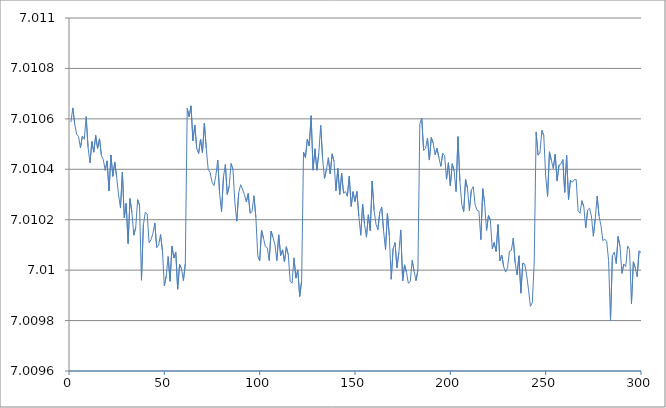
| Category | z(i) |
|---|---|
| 0 | 7.011 |
| 1 | 7.011 |
| 2 | 7.011 |
| 3 | 7.011 |
| 4 | 7.011 |
| 5 | 7.01 |
| 6 | 7.011 |
| 7 | 7.011 |
| 8 | 7.011 |
| 9 | 7.01 |
| 10 | 7.01 |
| 11 | 7.011 |
| 12 | 7.01 |
| 13 | 7.011 |
| 14 | 7.01 |
| 15 | 7.011 |
| 16 | 7.01 |
| 17 | 7.01 |
| 18 | 7.01 |
| 19 | 7.01 |
| 20 | 7.01 |
| 21 | 7.01 |
| 22 | 7.01 |
| 23 | 7.01 |
| 24 | 7.01 |
| 25 | 7.01 |
| 26 | 7.01 |
| 27 | 7.01 |
| 28 | 7.01 |
| 29 | 7.01 |
| 30 | 7.01 |
| 31 | 7.01 |
| 32 | 7.01 |
| 33 | 7.01 |
| 34 | 7.01 |
| 35 | 7.01 |
| 36 | 7.01 |
| 37 | 7.01 |
| 38 | 7.01 |
| 39 | 7.01 |
| 40 | 7.01 |
| 41 | 7.01 |
| 42 | 7.01 |
| 43 | 7.01 |
| 44 | 7.01 |
| 45 | 7.01 |
| 46 | 7.01 |
| 47 | 7.01 |
| 48 | 7.01 |
| 49 | 7.01 |
| 50 | 7.01 |
| 51 | 7.01 |
| 52 | 7.01 |
| 53 | 7.01 |
| 54 | 7.01 |
| 55 | 7.01 |
| 56 | 7.01 |
| 57 | 7.01 |
| 58 | 7.01 |
| 59 | 7.01 |
| 60 | 7.01 |
| 61 | 7.011 |
| 62 | 7.011 |
| 63 | 7.011 |
| 64 | 7.011 |
| 65 | 7.011 |
| 66 | 7.01 |
| 67 | 7.01 |
| 68 | 7.011 |
| 69 | 7.01 |
| 70 | 7.011 |
| 71 | 7.01 |
| 72 | 7.01 |
| 73 | 7.01 |
| 74 | 7.01 |
| 75 | 7.01 |
| 76 | 7.01 |
| 77 | 7.01 |
| 78 | 7.01 |
| 79 | 7.01 |
| 80 | 7.01 |
| 81 | 7.01 |
| 82 | 7.01 |
| 83 | 7.01 |
| 84 | 7.01 |
| 85 | 7.01 |
| 86 | 7.01 |
| 87 | 7.01 |
| 88 | 7.01 |
| 89 | 7.01 |
| 90 | 7.01 |
| 91 | 7.01 |
| 92 | 7.01 |
| 93 | 7.01 |
| 94 | 7.01 |
| 95 | 7.01 |
| 96 | 7.01 |
| 97 | 7.01 |
| 98 | 7.01 |
| 99 | 7.01 |
| 100 | 7.01 |
| 101 | 7.01 |
| 102 | 7.01 |
| 103 | 7.01 |
| 104 | 7.01 |
| 105 | 7.01 |
| 106 | 7.01 |
| 107 | 7.01 |
| 108 | 7.01 |
| 109 | 7.01 |
| 110 | 7.01 |
| 111 | 7.01 |
| 112 | 7.01 |
| 113 | 7.01 |
| 114 | 7.01 |
| 115 | 7.01 |
| 116 | 7.01 |
| 117 | 7.01 |
| 118 | 7.01 |
| 119 | 7.01 |
| 120 | 7.01 |
| 121 | 7.01 |
| 122 | 7.01 |
| 123 | 7.01 |
| 124 | 7.011 |
| 125 | 7.01 |
| 126 | 7.011 |
| 127 | 7.01 |
| 128 | 7.01 |
| 129 | 7.01 |
| 130 | 7.01 |
| 131 | 7.011 |
| 132 | 7.01 |
| 133 | 7.01 |
| 134 | 7.01 |
| 135 | 7.01 |
| 136 | 7.01 |
| 137 | 7.01 |
| 138 | 7.01 |
| 139 | 7.01 |
| 140 | 7.01 |
| 141 | 7.01 |
| 142 | 7.01 |
| 143 | 7.01 |
| 144 | 7.01 |
| 145 | 7.01 |
| 146 | 7.01 |
| 147 | 7.01 |
| 148 | 7.01 |
| 149 | 7.01 |
| 150 | 7.01 |
| 151 | 7.01 |
| 152 | 7.01 |
| 153 | 7.01 |
| 154 | 7.01 |
| 155 | 7.01 |
| 156 | 7.01 |
| 157 | 7.01 |
| 158 | 7.01 |
| 159 | 7.01 |
| 160 | 7.01 |
| 161 | 7.01 |
| 162 | 7.01 |
| 163 | 7.01 |
| 164 | 7.01 |
| 165 | 7.01 |
| 166 | 7.01 |
| 167 | 7.01 |
| 168 | 7.01 |
| 169 | 7.01 |
| 170 | 7.01 |
| 171 | 7.01 |
| 172 | 7.01 |
| 173 | 7.01 |
| 174 | 7.01 |
| 175 | 7.01 |
| 176 | 7.01 |
| 177 | 7.01 |
| 178 | 7.01 |
| 179 | 7.01 |
| 180 | 7.01 |
| 181 | 7.01 |
| 182 | 7.01 |
| 183 | 7.011 |
| 184 | 7.011 |
| 185 | 7.01 |
| 186 | 7.01 |
| 187 | 7.011 |
| 188 | 7.01 |
| 189 | 7.011 |
| 190 | 7.011 |
| 191 | 7.01 |
| 192 | 7.01 |
| 193 | 7.01 |
| 194 | 7.01 |
| 195 | 7.01 |
| 196 | 7.01 |
| 197 | 7.01 |
| 198 | 7.01 |
| 199 | 7.01 |
| 200 | 7.01 |
| 201 | 7.01 |
| 202 | 7.01 |
| 203 | 7.011 |
| 204 | 7.01 |
| 205 | 7.01 |
| 206 | 7.01 |
| 207 | 7.01 |
| 208 | 7.01 |
| 209 | 7.01 |
| 210 | 7.01 |
| 211 | 7.01 |
| 212 | 7.01 |
| 213 | 7.01 |
| 214 | 7.01 |
| 215 | 7.01 |
| 216 | 7.01 |
| 217 | 7.01 |
| 218 | 7.01 |
| 219 | 7.01 |
| 220 | 7.01 |
| 221 | 7.01 |
| 222 | 7.01 |
| 223 | 7.01 |
| 224 | 7.01 |
| 225 | 7.01 |
| 226 | 7.01 |
| 227 | 7.01 |
| 228 | 7.01 |
| 229 | 7.01 |
| 230 | 7.01 |
| 231 | 7.01 |
| 232 | 7.01 |
| 233 | 7.01 |
| 234 | 7.01 |
| 235 | 7.01 |
| 236 | 7.01 |
| 237 | 7.01 |
| 238 | 7.01 |
| 239 | 7.01 |
| 240 | 7.01 |
| 241 | 7.01 |
| 242 | 7.01 |
| 243 | 7.01 |
| 244 | 7.011 |
| 245 | 7.01 |
| 246 | 7.01 |
| 247 | 7.011 |
| 248 | 7.011 |
| 249 | 7.01 |
| 250 | 7.01 |
| 251 | 7.01 |
| 252 | 7.01 |
| 253 | 7.01 |
| 254 | 7.01 |
| 255 | 7.01 |
| 256 | 7.01 |
| 257 | 7.01 |
| 258 | 7.01 |
| 259 | 7.01 |
| 260 | 7.01 |
| 261 | 7.01 |
| 262 | 7.01 |
| 263 | 7.01 |
| 264 | 7.01 |
| 265 | 7.01 |
| 266 | 7.01 |
| 267 | 7.01 |
| 268 | 7.01 |
| 269 | 7.01 |
| 270 | 7.01 |
| 271 | 7.01 |
| 272 | 7.01 |
| 273 | 7.01 |
| 274 | 7.01 |
| 275 | 7.01 |
| 276 | 7.01 |
| 277 | 7.01 |
| 278 | 7.01 |
| 279 | 7.01 |
| 280 | 7.01 |
| 281 | 7.01 |
| 282 | 7.01 |
| 283 | 7.01 |
| 284 | 7.01 |
| 285 | 7.01 |
| 286 | 7.01 |
| 287 | 7.01 |
| 288 | 7.01 |
| 289 | 7.01 |
| 290 | 7.01 |
| 291 | 7.01 |
| 292 | 7.01 |
| 293 | 7.01 |
| 294 | 7.01 |
| 295 | 7.01 |
| 296 | 7.01 |
| 297 | 7.01 |
| 298 | 7.01 |
| 299 | 7.01 |
| 300 | 7.01 |
| 301 | 7.01 |
| 302 | 7.01 |
| 303 | 7.01 |
| 304 | 7.01 |
| 305 | 7.011 |
| 306 | 7.011 |
| 307 | 7.01 |
| 308 | 7.011 |
| 309 | 7.011 |
| 310 | 7.011 |
| 311 | 7.011 |
| 312 | 7.01 |
| 313 | 7.011 |
| 314 | 7.011 |
| 315 | 7.011 |
| 316 | 7.01 |
| 317 | 7.011 |
| 318 | 7.01 |
| 319 | 7.01 |
| 320 | 7.01 |
| 321 | 7.01 |
| 322 | 7.01 |
| 323 | 7.011 |
| 324 | 7.01 |
| 325 | 7.011 |
| 326 | 7.01 |
| 327 | 7.01 |
| 328 | 7.01 |
| 329 | 7.011 |
| 330 | 7.01 |
| 331 | 7.01 |
| 332 | 7.01 |
| 333 | 7.01 |
| 334 | 7.01 |
| 335 | 7.01 |
| 336 | 7.01 |
| 337 | 7.01 |
| 338 | 7.01 |
| 339 | 7.01 |
| 340 | 7.01 |
| 341 | 7.01 |
| 342 | 7.01 |
| 343 | 7.01 |
| 344 | 7.01 |
| 345 | 7.01 |
| 346 | 7.01 |
| 347 | 7.01 |
| 348 | 7.01 |
| 349 | 7.01 |
| 350 | 7.01 |
| 351 | 7.01 |
| 352 | 7.01 |
| 353 | 7.01 |
| 354 | 7.01 |
| 355 | 7.01 |
| 356 | 7.01 |
| 357 | 7.01 |
| 358 | 7.01 |
| 359 | 7.01 |
| 360 | 7.01 |
| 361 | 7.01 |
| 362 | 7.01 |
| 363 | 7.01 |
| 364 | 7.01 |
| 365 | 7.01 |
| 366 | 7.01 |
| 367 | 7.01 |
| 368 | 7.011 |
| 369 | 7.011 |
| 370 | 7.011 |
| 371 | 7.011 |
| 372 | 7.01 |
| 373 | 7.01 |
| 374 | 7.01 |
| 375 | 7.01 |
| 376 | 7.01 |
| 377 | 7.01 |
| 378 | 7.011 |
| 379 | 7.01 |
| 380 | 7.01 |
| 381 | 7.01 |
| 382 | 7.01 |
| 383 | 7.01 |
| 384 | 7.01 |
| 385 | 7.01 |
| 386 | 7.01 |
| 387 | 7.01 |
| 388 | 7.01 |
| 389 | 7.01 |
| 390 | 7.01 |
| 391 | 7.01 |
| 392 | 7.01 |
| 393 | 7.01 |
| 394 | 7.01 |
| 395 | 7.01 |
| 396 | 7.01 |
| 397 | 7.01 |
| 398 | 7.01 |
| 399 | 7.01 |
| 400 | 7.01 |
| 401 | 7.01 |
| 402 | 7.01 |
| 403 | 7.01 |
| 404 | 7.01 |
| 405 | 7.01 |
| 406 | 7.01 |
| 407 | 7.01 |
| 408 | 7.01 |
| 409 | 7.01 |
| 410 | 7.01 |
| 411 | 7.01 |
| 412 | 7.01 |
| 413 | 7.01 |
| 414 | 7.01 |
| 415 | 7.01 |
| 416 | 7.01 |
| 417 | 7.01 |
| 418 | 7.01 |
| 419 | 7.01 |
| 420 | 7.01 |
| 421 | 7.01 |
| 422 | 7.01 |
| 423 | 7.01 |
| 424 | 7.01 |
| 425 | 7.01 |
| 426 | 7.01 |
| 427 | 7.011 |
| 428 | 7.011 |
| 429 | 7.011 |
| 430 | 7.01 |
| 431 | 7.011 |
| 432 | 7.01 |
| 433 | 7.01 |
| 434 | 7.01 |
| 435 | 7.01 |
| 436 | 7.01 |
| 437 | 7.01 |
| 438 | 7.01 |
| 439 | 7.01 |
| 440 | 7.01 |
| 441 | 7.01 |
| 442 | 7.01 |
| 443 | 7.01 |
| 444 | 7.01 |
| 445 | 7.01 |
| 446 | 7.01 |
| 447 | 7.01 |
| 448 | 7.01 |
| 449 | 7.01 |
| 450 | 7.01 |
| 451 | 7.01 |
| 452 | 7.01 |
| 453 | 7.01 |
| 454 | 7.01 |
| 455 | 7.01 |
| 456 | 7.01 |
| 457 | 7.01 |
| 458 | 7.01 |
| 459 | 7.01 |
| 460 | 7.01 |
| 461 | 7.01 |
| 462 | 7.01 |
| 463 | 7.01 |
| 464 | 7.01 |
| 465 | 7.01 |
| 466 | 7.01 |
| 467 | 7.01 |
| 468 | 7.01 |
| 469 | 7.01 |
| 470 | 7.01 |
| 471 | 7.01 |
| 472 | 7.01 |
| 473 | 7.01 |
| 474 | 7.01 |
| 475 | 7.01 |
| 476 | 7.01 |
| 477 | 7.01 |
| 478 | 7.01 |
| 479 | 7.01 |
| 480 | 7.01 |
| 481 | 7.01 |
| 482 | 7.01 |
| 483 | 7.01 |
| 484 | 7.01 |
| 485 | 7.01 |
| 486 | 7.01 |
| 487 | 7.01 |
| 488 | 7.011 |
| 489 | 7.011 |
| 490 | 7.011 |
| 491 | 7.011 |
| 492 | 7.011 |
| 493 | 7.01 |
| 494 | 7.011 |
| 495 | 7.01 |
| 496 | 7.011 |
| 497 | 7.01 |
| 498 | 7.01 |
| 499 | 7.011 |
| 500 | 7.01 |
| 501 | 7.01 |
| 502 | 7.01 |
| 503 | 7.01 |
| 504 | 7.01 |
| 505 | 7.01 |
| 506 | 7.01 |
| 507 | 7.01 |
| 508 | 7.01 |
| 509 | 7.01 |
| 510 | 7.01 |
| 511 | 7.01 |
| 512 | 7.01 |
| 513 | 7.01 |
| 514 | 7.01 |
| 515 | 7.01 |
| 516 | 7.01 |
| 517 | 7.01 |
| 518 | 7.01 |
| 519 | 7.01 |
| 520 | 7.01 |
| 521 | 7.01 |
| 522 | 7.01 |
| 523 | 7.01 |
| 524 | 7.01 |
| 525 | 7.01 |
| 526 | 7.01 |
| 527 | 7.01 |
| 528 | 7.01 |
| 529 | 7.01 |
| 530 | 7.01 |
| 531 | 7.01 |
| 532 | 7.01 |
| 533 | 7.01 |
| 534 | 7.01 |
| 535 | 7.01 |
| 536 | 7.01 |
| 537 | 7.01 |
| 538 | 7.01 |
| 539 | 7.01 |
| 540 | 7.01 |
| 541 | 7.01 |
| 542 | 7.01 |
| 543 | 7.01 |
| 544 | 7.01 |
| 545 | 7.01 |
| 546 | 7.01 |
| 547 | 7.01 |
| 548 | 7.01 |
| 549 | 7.011 |
| 550 | 7.011 |
| 551 | 7.011 |
| 552 | 7.011 |
| 553 | 7.011 |
| 554 | 7.011 |
| 555 | 7.011 |
| 556 | 7.01 |
| 557 | 7.011 |
| 558 | 7.011 |
| 559 | 7.01 |
| 560 | 7.01 |
| 561 | 7.011 |
| 562 | 7.01 |
| 563 | 7.01 |
| 564 | 7.011 |
| 565 | 7.01 |
| 566 | 7.01 |
| 567 | 7.01 |
| 568 | 7.01 |
| 569 | 7.01 |
| 570 | 7.01 |
| 571 | 7.01 |
| 572 | 7.01 |
| 573 | 7.01 |
| 574 | 7.01 |
| 575 | 7.01 |
| 576 | 7.01 |
| 577 | 7.01 |
| 578 | 7.01 |
| 579 | 7.01 |
| 580 | 7.01 |
| 581 | 7.01 |
| 582 | 7.01 |
| 583 | 7.01 |
| 584 | 7.01 |
| 585 | 7.01 |
| 586 | 7.01 |
| 587 | 7.01 |
| 588 | 7.01 |
| 589 | 7.01 |
| 590 | 7.01 |
| 591 | 7.01 |
| 592 | 7.01 |
| 593 | 7.01 |
| 594 | 7.01 |
| 595 | 7.01 |
| 596 | 7.01 |
| 597 | 7.01 |
| 598 | 7.01 |
| 599 | 7.01 |
| 600 | 7.01 |
| 601 | 7.01 |
| 602 | 7.01 |
| 603 | 7.01 |
| 604 | 7.01 |
| 605 | 7.01 |
| 606 | 7.01 |
| 607 | 7.01 |
| 608 | 7.01 |
| 609 | 7.01 |